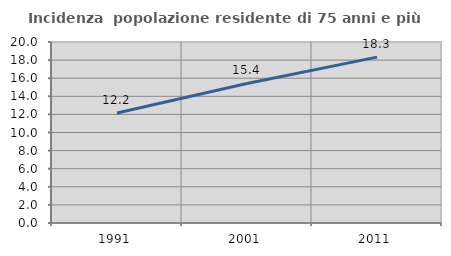
| Category | Incidenza  popolazione residente di 75 anni e più |
|---|---|
| 1991.0 | 12.163 |
| 2001.0 | 15.421 |
| 2011.0 | 18.328 |